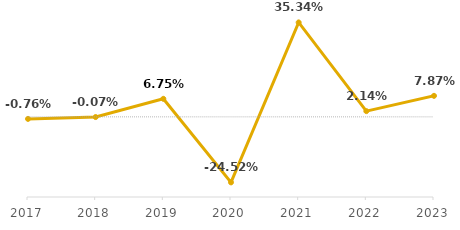
| Category | Tasa de variación | Base cero |
|---|---|---|
| 2017 | -0.008 | 0 |
| 2018 | -0.001 | 0 |
| 2019 | 0.068 | 0 |
| 2020 | -0.245 | 0 |
| 2021 | 0.353 | 0 |
| 2022 | 0.021 | 0 |
| 2023 | 0.079 | 0 |